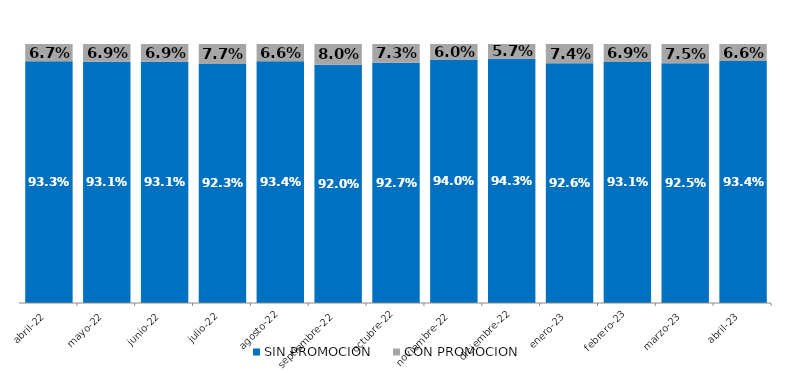
| Category | SIN PROMOCION   | CON PROMOCION   |
|---|---|---|
| 2022-04-01 | 0.933 | 0.067 |
| 2022-05-01 | 0.931 | 0.069 |
| 2022-06-01 | 0.931 | 0.069 |
| 2022-07-01 | 0.923 | 0.077 |
| 2022-08-01 | 0.934 | 0.066 |
| 2022-09-01 | 0.92 | 0.08 |
| 2022-10-01 | 0.927 | 0.073 |
| 2022-11-01 | 0.94 | 0.06 |
| 2022-12-01 | 0.943 | 0.057 |
| 2023-01-01 | 0.926 | 0.074 |
| 2023-02-01 | 0.931 | 0.069 |
| 2023-03-01 | 0.925 | 0.075 |
| 2023-04-01 | 0.934 | 0.066 |